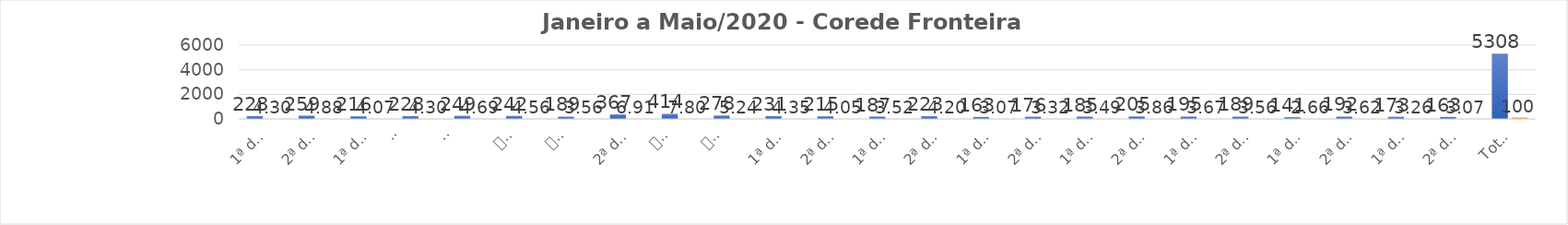
| Category | Series 0 | Series 1 |
|---|---|---|
| 1ª de Janeiro de 2020 | 228 | 4.295 |
| 2ª de Janeiro de 2020 | 259 | 4.879 |
| 1ª de Fevereiro de 2020 | 216 | 4.069 |
| 
2ª de Fevereiro de 2020
 | 228 | 4.295 |
| 
1ª de Março de 2020
 | 249 | 4.691 |
| 
2ª de Março de 2020 | 242 | 4.559 |
| 
1ª de Abril de 2020 | 189 | 3.561 |
| 2ª de Abril de 2020 | 367 | 6.914 |
| 
1ª de Maio de 2020 | 414 | 7.8 |
| 
2ª de Maio de 2020 | 278 | 5.237 |
| 1ª de Junho de 2020 | 231 | 4.352 |
| 2ª de Junho de 2020 | 215 | 4.05 |
| 1ª de Julho de 2020 | 187 | 3.523 |
| 2ª de Julho de 2020 | 223 | 4.201 |
| 1ª de Agosto de 2020 | 163 | 3.071 |
| 2ª de Agosto de 2020 | 176 | 3.316 |
| 1ª de Setembro de 2020 | 185 | 3.485 |
| 2ª de Setembro de 2020 | 205 | 3.862 |
| 1ª de Outubro de 2020 | 195 | 3.674 |
| 2ª de Outubro de 2020 | 189 | 3.561 |
| 1ª de Novembro de 2020 | 141 | 2.656 |
| 2ª de Novembro de 2020 | 192 | 3.617 |
| 1ª de Dezembro de 2020 | 173 | 3.259 |
| 2ª de Dezembro de 2020 | 163 | 3.071 |
| Total Geral | 5308 | 100 |